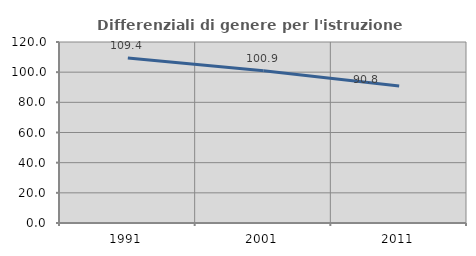
| Category | Differenziali di genere per l'istruzione superiore |
|---|---|
| 1991.0 | 109.383 |
| 2001.0 | 100.932 |
| 2011.0 | 90.829 |